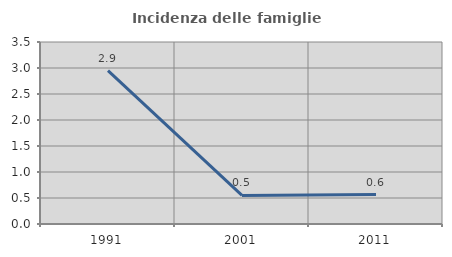
| Category | Incidenza delle famiglie numerose |
|---|---|
| 1991.0 | 2.95 |
| 2001.0 | 0.549 |
| 2011.0 | 0.567 |